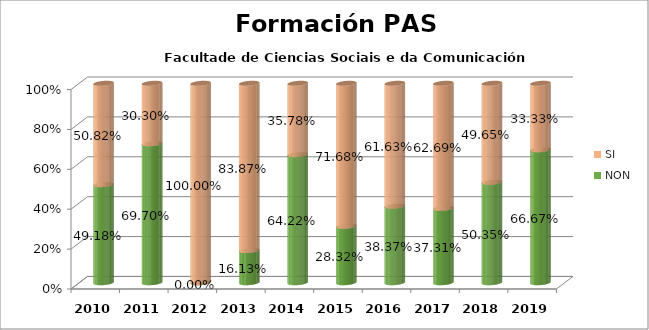
| Category | NON | SI |
|---|---|---|
| 2010.0 | 0.492 | 0.508 |
| 2011.0 | 0.697 | 0.303 |
| 2012.0 | 0 | 1 |
| 2013.0 | 0.161 | 0.839 |
| 2014.0 | 0.642 | 0.358 |
| 2015.0 | 0.283 | 0.717 |
| 2016.0 | 0.384 | 0.616 |
| 2017.0 | 0.373 | 0.627 |
| 2018.0 | 0.504 | 0.496 |
| 2019.0 | 0.667 | 0.333 |